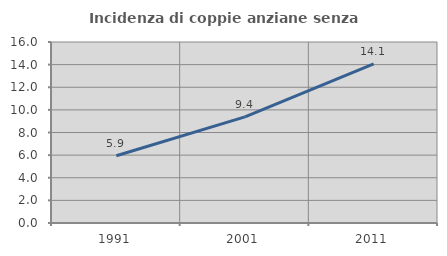
| Category | Incidenza di coppie anziane senza figli  |
|---|---|
| 1991.0 | 5.946 |
| 2001.0 | 9.383 |
| 2011.0 | 14.057 |